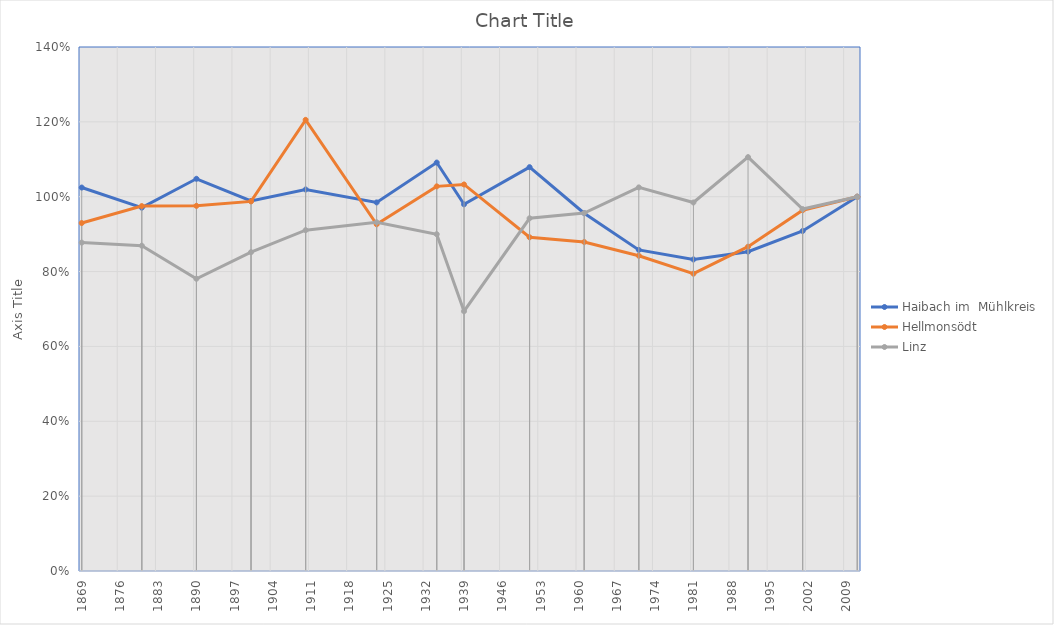
| Category | Haibach im  Mühlkreis | Hellmonsödt | Linz |
|---|---|---|---|
| 2011.0 | 1 | 1 | 1 |
| 2001.0 | 0.908 | 0.964 | 0.967 |
| 1991.0 | 0.853 | 0.866 | 1.106 |
| 1981.0 | 0.832 | 0.794 | 0.985 |
| 1971.0 | 0.858 | 0.842 | 1.025 |
| 1961.0 | 0.956 | 0.879 | 0.957 |
| 1951.0 | 1.079 | 0.892 | 0.942 |
| 1939.0 | 0.98 | 1.033 | 0.694 |
| 1934.0 | 1.091 | 1.028 | 0.9 |
| 1923.0 | 0.985 | 0.926 | 0.932 |
| 1910.0 | 1.019 | 1.205 | 0.911 |
| 1900.0 | 0.989 | 0.988 | 0.852 |
| 1890.0 | 1.048 | 0.976 | 0.781 |
| 1880.0 | 0.971 | 0.975 | 0.869 |
| 1869.0 | 1.024 | 0.93 | 0.877 |